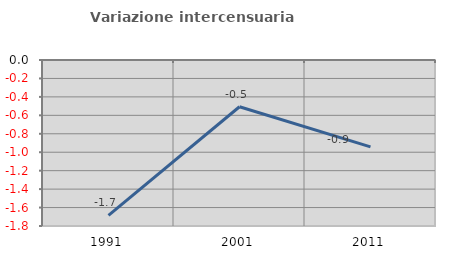
| Category | Variazione intercensuaria annua |
|---|---|
| 1991.0 | -1.684 |
| 2001.0 | -0.507 |
| 2011.0 | -0.942 |